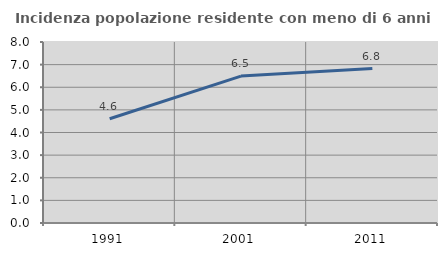
| Category | Incidenza popolazione residente con meno di 6 anni |
|---|---|
| 1991.0 | 4.606 |
| 2001.0 | 6.493 |
| 2011.0 | 6.826 |